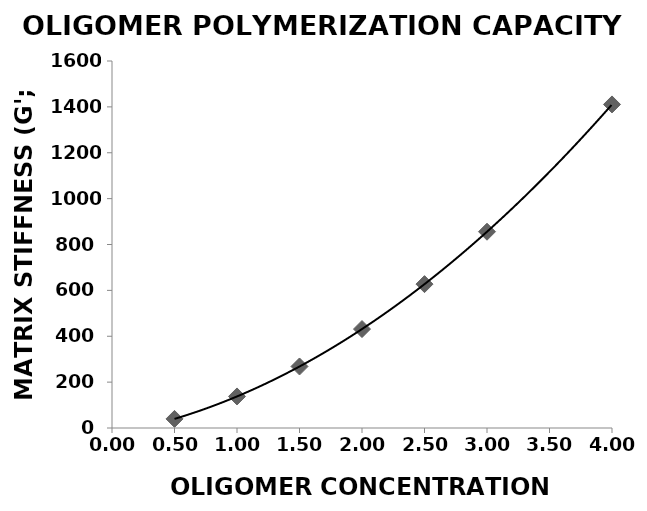
| Category | Series 0 |
|---|---|
| 0.5 | 39.693 |
| 1.0 | 137.593 |
| 1.5 | 268.144 |
| 2.0 | 431.347 |
| 2.5 | 627.201 |
| 3.0 | 855.707 |
| 4.0 | 1410.673 |